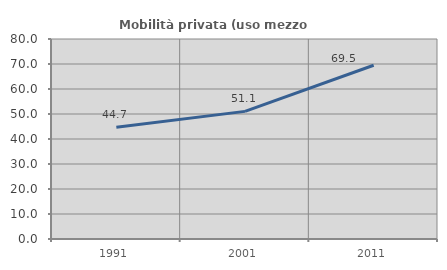
| Category | Mobilità privata (uso mezzo privato) |
|---|---|
| 1991.0 | 44.742 |
| 2001.0 | 51.054 |
| 2011.0 | 69.5 |